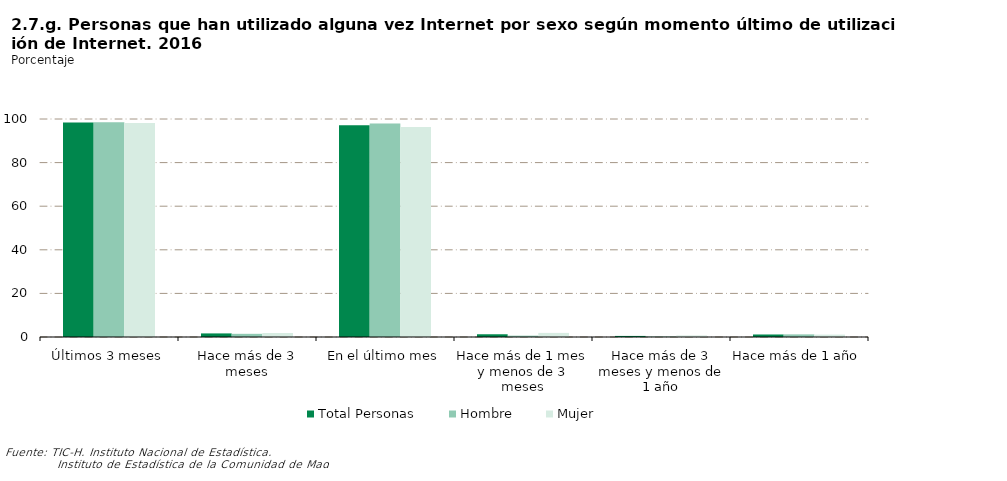
| Category | Total Personas | Hombre | Mujer |
|---|---|---|---|
| Últimos 3 meses | 98.352 | 98.542 | 98.163 |
| Hace más de 3 meses | 1.648 | 1.458 | 1.837 |
| En el último mes | 97.097 | 97.918 | 96.275 |
| Hace más de 1 mes y menos de 3 meses | 1.256 | 0.624 | 1.888 |
| Hace más de 3 meses y menos de 1 año | 0.493 | 0.249 | 0.738 |
| Hace más de 1 año | 1.154 | 1.209 | 1.099 |